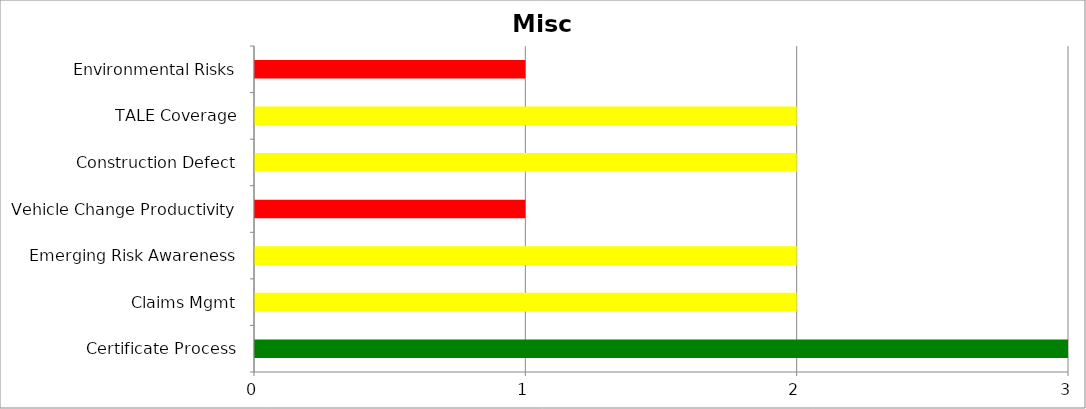
| Category | Low | Medium | High |
|---|---|---|---|
| Certificate Process | 3 | 0 | 0 |
| Claims Mgmt | 0 | 2 | 0 |
| Emerging Risk Awareness | 0 | 2 | 0 |
| Vehicle Change Productivity | 0 | 0 | 1 |
| Construction Defect | 0 | 2 | 0 |
| TALE Coverage | 0 | 2 | 0 |
|  Environmental Risks | 0 | 0 | 1 |